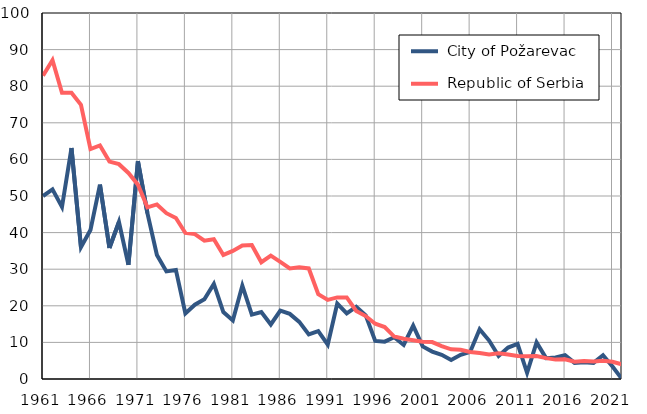
| Category |  City of Požarevac |  Republic of Serbia |
|---|---|---|
| 1961.0 | 50 | 82.9 |
| 1962.0 | 51.8 | 87.1 |
| 1963.0 | 47 | 78.2 |
| 1964.0 | 63.1 | 78.2 |
| 1965.0 | 36 | 74.9 |
| 1966.0 | 40.7 | 62.8 |
| 1967.0 | 53.1 | 63.8 |
| 1968.0 | 35.8 | 59.4 |
| 1969.0 | 42.9 | 58.7 |
| 1970.0 | 31.2 | 56.3 |
| 1971.0 | 59.5 | 53.1 |
| 1972.0 | 45.3 | 46.9 |
| 1973.0 | 33.9 | 47.7 |
| 1974.0 | 29.4 | 45.3 |
| 1975.0 | 29.8 | 44 |
| 1976.0 | 17.9 | 39.9 |
| 1977.0 | 20.3 | 39.6 |
| 1978.0 | 21.8 | 37.8 |
| 1979.0 | 26 | 38.2 |
| 1980.0 | 18.3 | 33.9 |
| 1981.0 | 16 | 35 |
| 1982.0 | 25.5 | 36.5 |
| 1983.0 | 17.6 | 36.6 |
| 1984.0 | 18.3 | 31.9 |
| 1985.0 | 14.9 | 33.7 |
| 1986.0 | 18.7 | 32 |
| 1987.0 | 17.8 | 30.2 |
| 1988.0 | 15.6 | 30.5 |
| 1989.0 | 12.2 | 30.2 |
| 1990.0 | 13.1 | 23.2 |
| 1991.0 | 9.4 | 21.6 |
| 1992.0 | 20.6 | 22.3 |
| 1993.0 | 17.9 | 22.3 |
| 1994.0 | 19.7 | 18.6 |
| 1995.0 | 17.4 | 17.2 |
| 1996.0 | 10.4 | 15.1 |
| 1997.0 | 10.2 | 14.2 |
| 1998.0 | 11.4 | 11.6 |
| 1999.0 | 9.3 | 11 |
| 2000.0 | 14.6 | 10.6 |
| 2001.0 | 8.9 | 10.2 |
| 2002.0 | 7.5 | 10.1 |
| 2003.0 | 6.6 | 9 |
| 2004.0 | 5.2 | 8.1 |
| 2005.0 | 6.6 | 8 |
| 2006.0 | 7.4 | 7.4 |
| 2007.0 | 13.6 | 7.1 |
| 2008.0 | 10.5 | 6.7 |
| 2009.0 | 6.3 | 7 |
| 2010.0 | 8.6 | 6.7 |
| 2011.0 | 9.6 | 6.3 |
| 2012.0 | 1.7 | 6.2 |
| 2013.0 | 10 | 6.3 |
| 2014.0 | 5.7 | 5.7 |
| 2015.0 | 5.9 | 5.3 |
| 2016.0 | 6.5 | 5.4 |
| 2017.0 | 4.4 | 4.7 |
| 2018.0 | 4.6 | 4.9 |
| 2019.0 | 4.4 | 4.8 |
| 2020.0 | 6.5 | 5 |
| 2021.0 | 3.4 | 4.7 |
| 2022.0 | 0 | 4 |